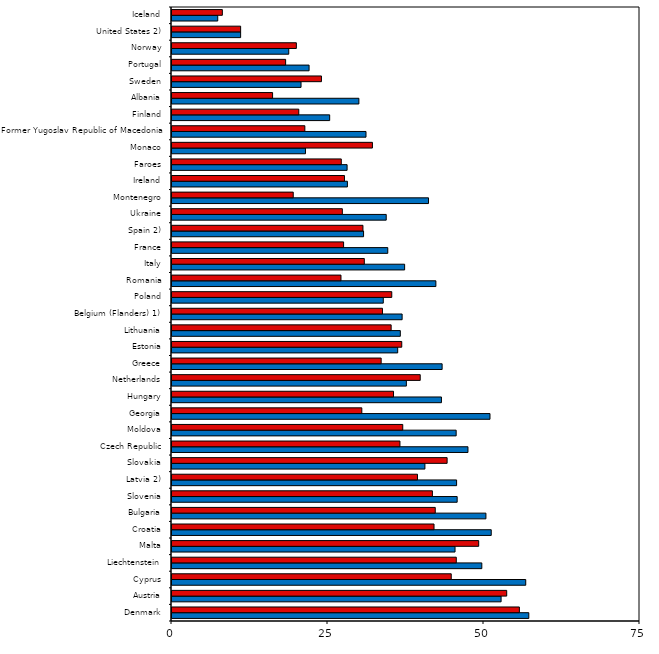
| Category | Boys | Girls |
|---|---|---|
| Denmark | 57.18 | 55.67 |
| Austria | 52.74 | 53.64 |
| Cyprus | 56.69 | 44.75 |
| Liechtenstein | 49.65 | 45.56 |
| Malta | 45.36 | 49.15 |
| Croatia | 51.16 | 41.99 |
| Bulgaria | 50.31 | 42.19 |
| Slovenia | 45.7 | 41.73 |
| Latvia 2) | 45.61 | 39.34 |
| Slovakia | 40.53 | 44.09 |
| Czech Republic | 47.43 | 36.53 |
| Moldova | 45.54 | 36.98 |
| Georgia | 50.96 | 30.42 |
| Hungary | 43.18 | 35.5 |
| Netherlands | 37.56 | 39.78 |
| Greece | 43.29 | 33.52 |
| Estonia | 36.17 | 36.82 |
| Lithuania | 36.59 | 35.12 |
| Belgium (Flanders) 1) | 36.88 | 33.73 |
| Poland | 33.86 | 35.22 |
| Romania | 42.29 | 27.08 |
| Italy | 37.28 | 30.82 |
| France | 34.58 | 27.5 |
| Spain 2) | 30.7 | 30.6 |
| Ukraine | 34.33 | 27.3 |
| Montenegro | 41.11 | 19.43 |
| Ireland | 28.11 | 27.64 |
| Faroes | 28.06 | 27.13 |
| Monaco | 21.39 | 32.12 |
| Former Yugoslav Republic of Macedonia | 31.09 | 21.29 |
| Finland | 25.27 | 20.32 |
| Albania | 29.95 | 16.12 |
| Sweden | 20.68 | 23.95 |
| Portugal | 21.97 | 18.21 |
| Norway | 18.71 | 19.93 |
| United States 2) | 11 | 11 |
| Iceland | 7.33 | 8.07 |